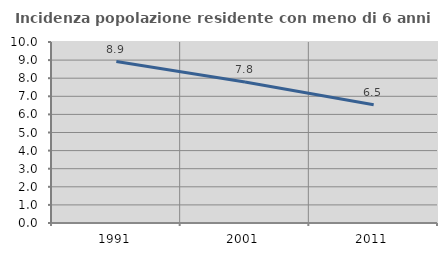
| Category | Incidenza popolazione residente con meno di 6 anni |
|---|---|
| 1991.0 | 8.918 |
| 2001.0 | 7.793 |
| 2011.0 | 6.53 |